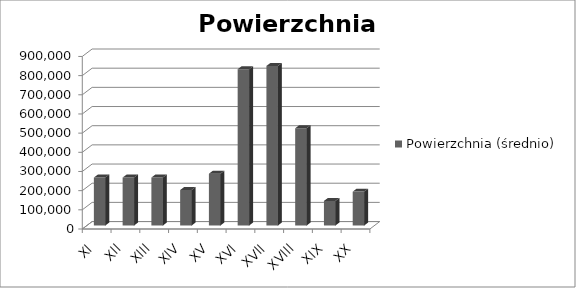
| Category | Powierzchnia (średnio) |
|---|---|
| Xl | 250000 |
| Xll | 250000 |
| Xlll | 250000 |
| XlV | 185000 |
| XV | 270000 |
| XVl | 815000 |
| XVll | 832000 |
| XVlll | 507000 |
| XlX | 128082 |
| XX | 176668 |